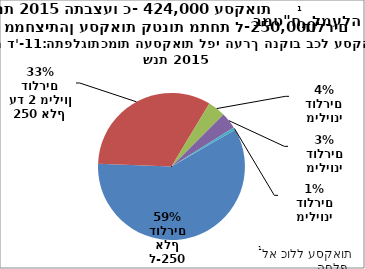
| Category | Series 0 |
|---|---|
|  מתחת ל-250 אלף דולרים | 405238 |
| 250 אלף עד 2 מיליון דולרים | 226899 |
|  2 - 4 מיליוני דולרים | 26601 |
| 4 - 16 מיליוני דולרים | 24642 |
|  מעל 16 מיליוני דולרים | 4110 |